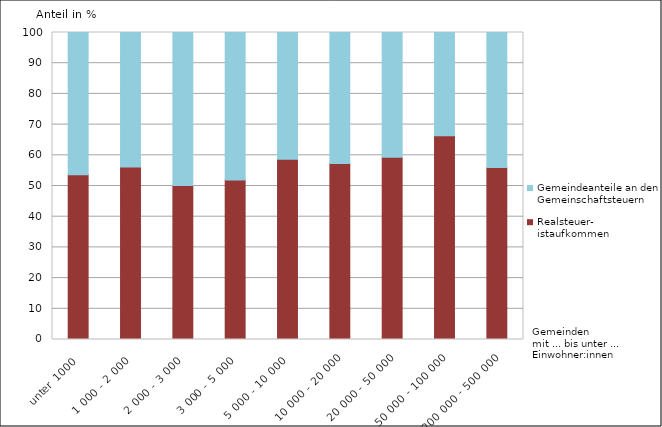
| Category | Realsteuer-
istaufkommen | Gemeindeanteile an den 
Gemeinschaftsteuern |
|---|---|---|
| unter 1000 | 53.63 | 46.37 |
| 1 000 - 2 000 | 56.226 | 43.774 |
| 2 000 - 3 000 | 50.147 | 49.853 |
| 3 000 - 5 000 | 51.95 | 48.05 |
| 5 000 - 10 000 | 58.718 | 41.282 |
| 10 000 - 20 000 | 57.29 | 42.71 |
| 20 000 - 50 000 | 59.357 | 40.643 |
| 50 000 - 100 000 | 66.335 | 33.665 |
| 200 000 - 500 000 | 56.004 | 43.996 |